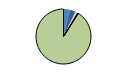
| Category | Series 0 |
|---|---|
| ARRASTRE | 32 |
| CERCO | 28 |
| ATUNEROS CAÑEROS | 2 |
| PALANGRE DE FONDO | 4 |
| PALANGRE DE SUPERFICIE | 8 |
| RASCO | 0 |
| VOLANTA | 1 |
| ARTES FIJAS | 2 |
| ARTES MENORES | 771 |